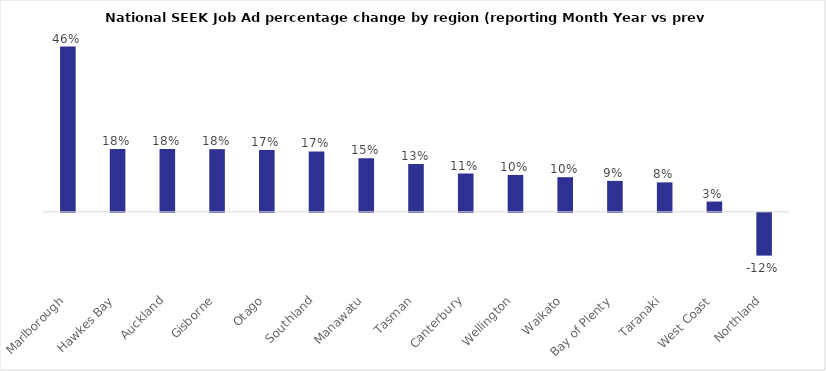
| Category | Series 0 |
|---|---|
| Bay of Plenty | 0.212 |
| West Coast | 0.212 |
| Otago | 0.209 |
| Waikato | 0.184 |
| Northland | 0.183 |
| Southland | 0.156 |
| Auckland | 0.133 |
| Gisborne | 0.105 |
| Canterbury | 0.085 |
| Hawkes Bay | 0.075 |
| Taranaki | 0.075 |
| Marlborough | 0.072 |
| Wellington | 0.069 |
| Tasman | 0.063 |
| Manawatu | 0.053 |